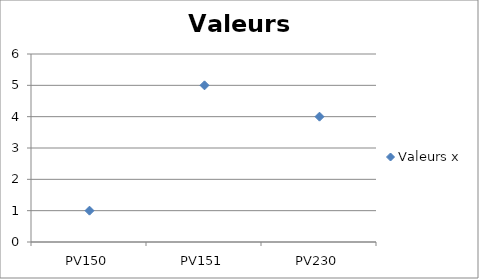
| Category | Valeurs x |
|---|---|
| PV150 | 1 |
| PV151 | 5 |
| PV230 | 4 |